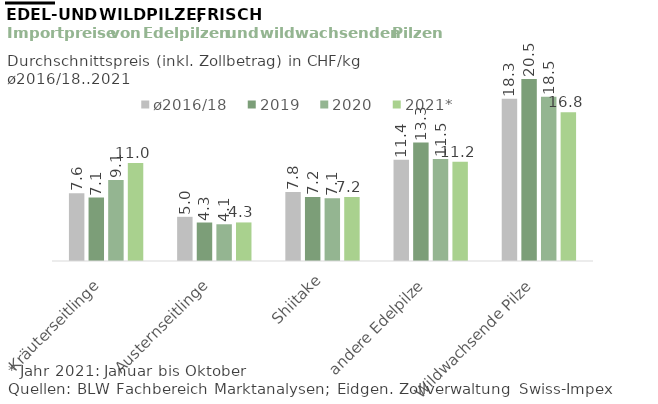
| Category | ø2016/18 | 2019 | 2020 | 2021* |
|---|---|---|---|---|
| Kräuterseitlinge | 7.637 | 7.138 | 9.128 | 11.024 |
| Austernseitlinge | 4.974 | 4.334 | 4.136 | 4.342 |
| Shiitake | 7.756 | 7.212 | 7.053 | 7.206 |
| andere Edelpilze | 11.408 | 13.336 | 11.481 | 11.187 |
| Wildwachsende Pilze | 18.267 | 20.486 | 18.5 | 16.764 |